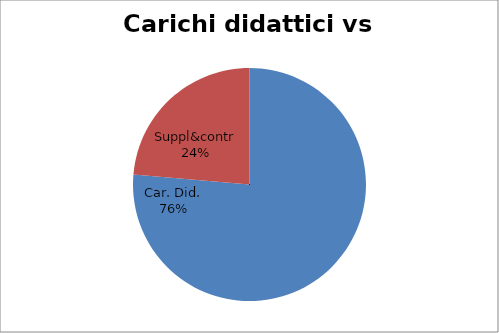
| Category | Series 0 |
|---|---|
| Car. Did. | 0.764 |
| Suppl&contr | 0.236 |